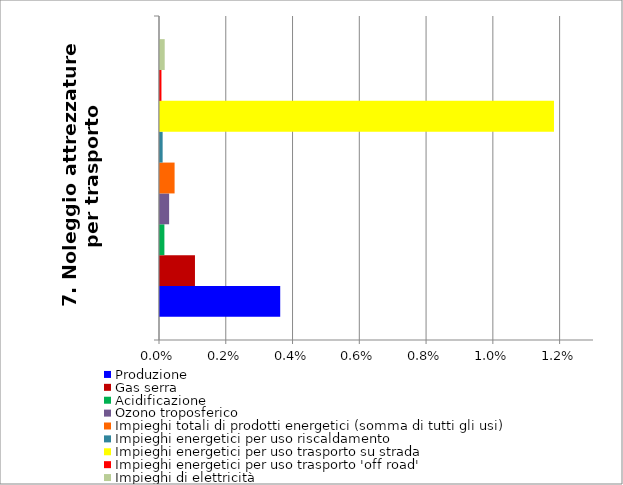
| Category | Produzione | Gas serra | Acidificazione | Ozono troposferico | Impieghi totali di prodotti energetici (somma di tutti gli usi) | Impieghi energetici per uso riscaldamento | Impieghi energetici per uso trasporto su strada | Impieghi energetici per uso trasporto 'off road' | Impieghi di elettricità |
|---|---|---|---|---|---|---|---|---|---|
| 7. Noleggio attrezzature per trasporto | 0.004 | 0.001 | 0 | 0 | 0 | 0 | 0.012 | 0 | 0 |